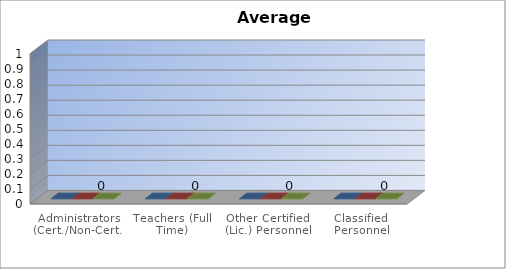
| Category | 2016-2017 | 2017-2018 | 2018-2019 |
|---|---|---|---|
| Administrators (Cert./Non-Cert.) | 0 | 0 | 0 |
| Teachers (Full Time) | 0 | 0 | 0 |
| Other Certified (Lic.) Personnel | 0 | 0 | 0 |
| Classified Personnel | 0 | 0 | 0 |